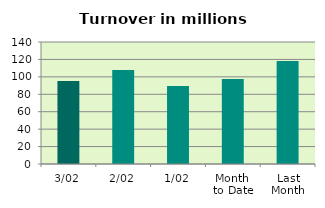
| Category | Series 0 |
|---|---|
| 3/02 | 95.302 |
| 2/02 | 107.759 |
| 1/02 | 89.509 |
| Month 
to Date | 97.524 |
| Last
Month | 118.136 |